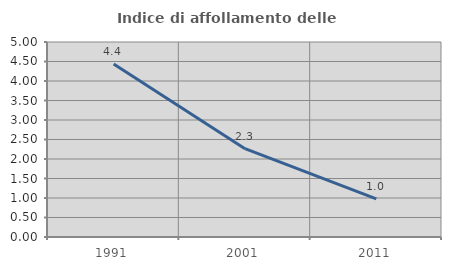
| Category | Indice di affollamento delle abitazioni  |
|---|---|
| 1991.0 | 4.433 |
| 2001.0 | 2.265 |
| 2011.0 | 0.976 |